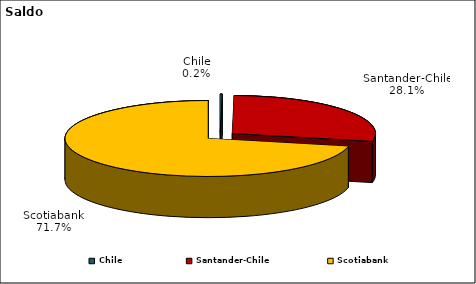
| Category | Saldo Mantenido |
|---|---|
| Chile | 0.002 |
| Santander-Chile | 0.281 |
| Scotiabank | 0.717 |